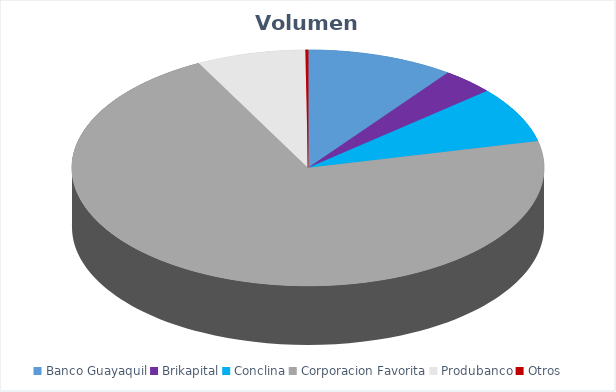
| Category | VOLUMEN ($USD) |
|---|---|
| Banco Guayaquil | 28017 |
| Brikapital | 10000 |
| Conclina | 21255 |
| Corporacion Favorita | 197397.62 |
| Produbanco | 20761.82 |
| Otros | 502.5 |